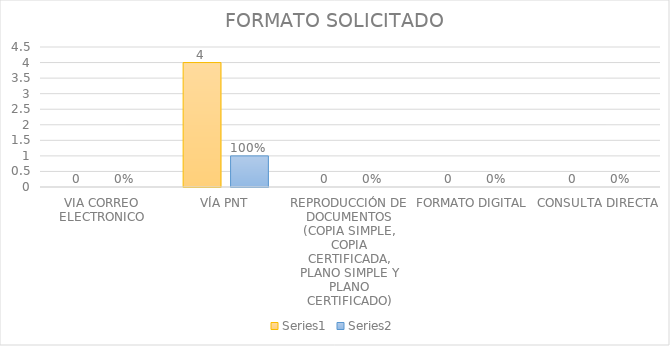
| Category | Series 3 | Series 4 |
|---|---|---|
| VIA CORREO ELECTRONICO | 0 | 0 |
| VÍA PNT | 4 | 1 |
| REPRODUCCIÓN DE DOCUMENTOS (COPIA SIMPLE, COPIA CERTIFICADA, PLANO SIMPLE Y PLANO CERTIFICADO) | 0 | 0 |
| FORMATO DIGITAL | 0 | 0 |
| CONSULTA DIRECTA | 0 | 0 |